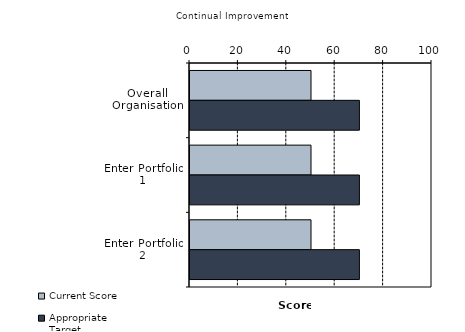
| Category | Current Score | Appropriate Target |
|---|---|---|
| Overall Organisation | 50 | 70 |
| Enter Portfolio 1 | 50 | 70 |
| Enter Portfolio 2 | 50 | 70 |